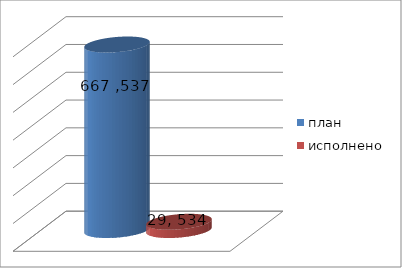
| Category | план | исполнено |
|---|---|---|
| 0 | 667537370 | 29534980.74 |